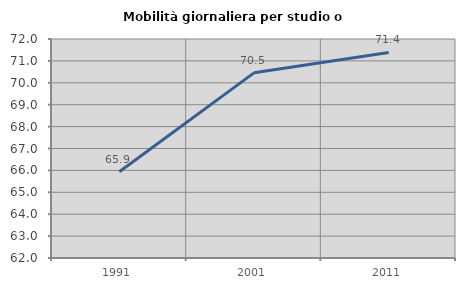
| Category | Mobilità giornaliera per studio o lavoro |
|---|---|
| 1991.0 | 65.942 |
| 2001.0 | 70.455 |
| 2011.0 | 71.386 |